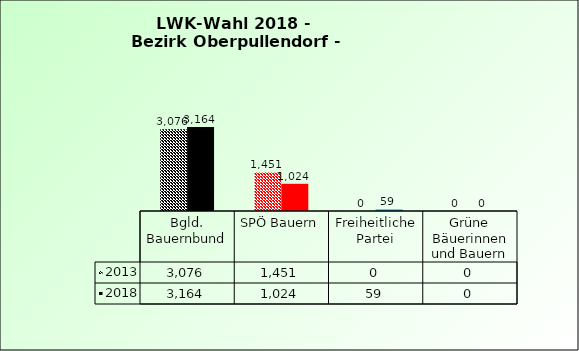
| Category | 2013 | 2018 |
|---|---|---|
| Bgld. Bauernbund | 3076 | 3164 |
| SPÖ Bauern | 1451 | 1024 |
| Freiheitliche Partei | 0 | 59 |
| Grüne Bäuerinnen und Bauern | 0 | 0 |